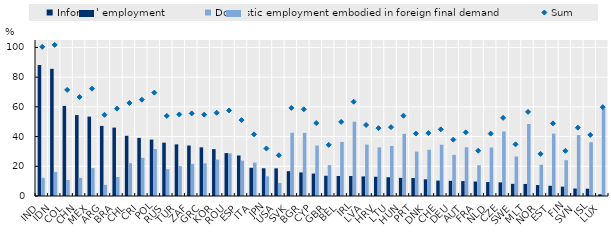
| Category | Informal employment | Domestic employment embodied in foreign final demand |
|---|---|---|
| IND | 88.23 | 12.2 |
| IDN | 85.59 | 16.1 |
| COL | 60.64 | 10.8 |
| CHN | 54.44 | 12.2 |
| MEX | 53.44 | 18.8 |
| ARG | 47.16 | 7.5 |
| BRA | 46.02 | 12.8 |
| CHL | 40.53 | 22.1 |
| CRI | 39.12 | 25.7 |
| POL | 37.97 | 31.6 |
| RUS | 35.89 | 18 |
| TUR | 34.77 | 20.1 |
| ZAF | 33.99 | 21.6 |
| GRC | 32.76 | 22 |
| KOR | 31.54 | 24.5 |
| ROU | 28.88 | 28.7 |
| ESP | 27.27 | 23.8 |
| ITA | 18.99 | 22.5 |
| JPN | 18.7 | 13.3 |
| USA | 18.62 | 8.8 |
| SVK | 16.7 | 42.6 |
| BGR | 15.87 | 42.5 |
| CYP | 15.1 | 34 |
| GBR | 13.62 | 20.8 |
| BEL | 13.48 | 36.4 |
| IRL | 13.45 | 50 |
| LVA | 13.2 | 34.6 |
| HRV | 12.98 | 32.7 |
| LTU | 12.63 | 33.7 |
| HUN | 12.22 | 41.8 |
| PRT | 12.13 | 29.9 |
| DNK | 11.24 | 31.1 |
| CHE | 10.36 | 34.5 |
| DEU | 10.22 | 27.7 |
| AUT | 10.04 | 32.8 |
| FRA | 9.75 | 20.7 |
| NLD | 9.37 | 32.6 |
| CZE | 9.19 | 43.4 |
| SWE | 8.17 | 26.6 |
| MLT | 8.11 | 48.5 |
| NOR | 7.35 | 21 |
| EST | 6.87 | 42 |
| FIN | 6.3 | 24.1 |
| SVN | 5.03 | 41 |
| ISL | 4.9 | 36.2 |
| LUX | 1.18 | 58.6 |